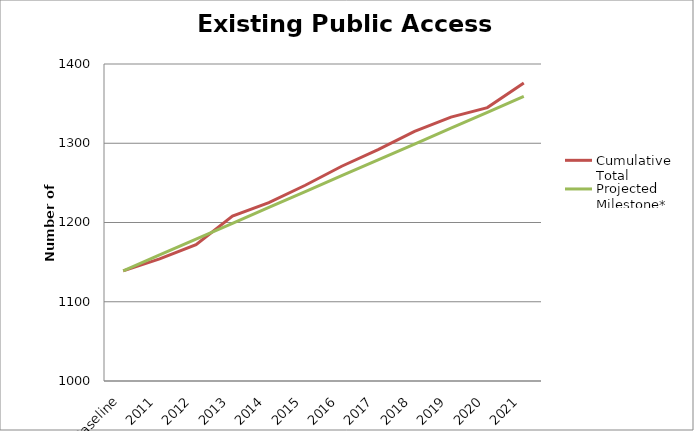
| Category | Cumulative Total | Projected Milestone* |
|---|---|---|
| Baseline | 1139 | 1139 |
| 2011 | 1154 | 1159 |
| 2012 | 1172 | 1179 |
| 2013 | 1208 | 1199 |
| 2014 | 1225 | 1219 |
| 2015 | 1247 | 1239 |
| 2016 | 1271 | 1259 |
| 2017 | 1292 | 1279 |
| 2018 | 1315 | 1299 |
| 2019 | 1333 | 1319 |
| 2020 | 1345 | 1339 |
| 2021 | 1376 | 1359 |